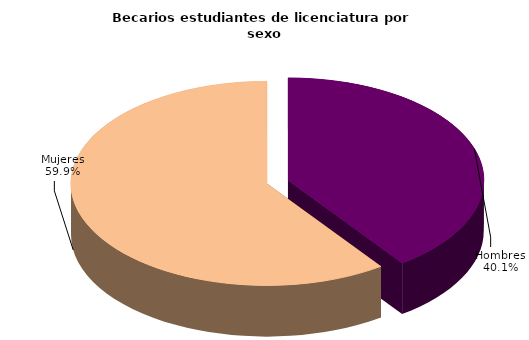
| Category | Series 0 |
|---|---|
| Hombres | 33448 |
| Mujeres | 49983 |